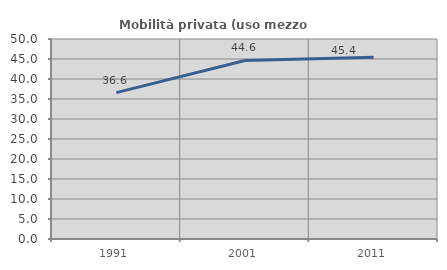
| Category | Mobilità privata (uso mezzo privato) |
|---|---|
| 1991.0 | 36.593 |
| 2001.0 | 44.629 |
| 2011.0 | 45.423 |